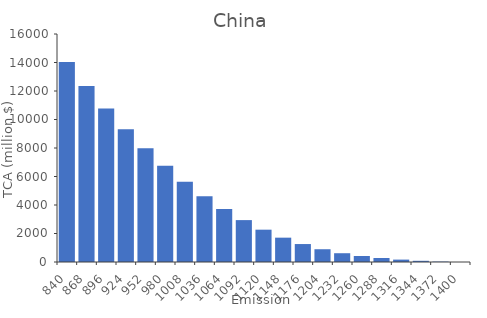
| Category | TCA (million $) |
|---|---|
| 840.0 | 14028 |
| 868.0 | 12348 |
| 896.0 | 10780 |
| 924.0 | 9324 |
| 952.0 | 7980 |
| 980.0 | 6748 |
| 1008.0 | 5628 |
| 1036.0 | 4620 |
| 1064.0 | 3724 |
| 1092.0 | 2940 |
| 1120.0 | 2268 |
| 1148.0 | 1708 |
| 1176.0 | 1260 |
| 1204.0 | 896 |
| 1232.0 | 616 |
| 1260.0 | 420 |
| 1288.0 | 280 |
| 1316.0 | 168 |
| 1344.0 | 84 |
| 1372.0 | 28 |
| 1400.0 | 0 |